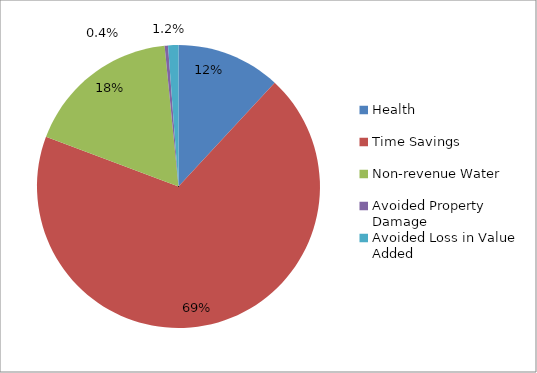
| Category | Series 0 |
|---|---|
| Health | 0.119 |
| Time Savings | 0.688 |
| Non-revenue Water | 0.177 |
| Avoided Property Damage | 0.004 |
| Avoided Loss in Value Added | 0.012 |